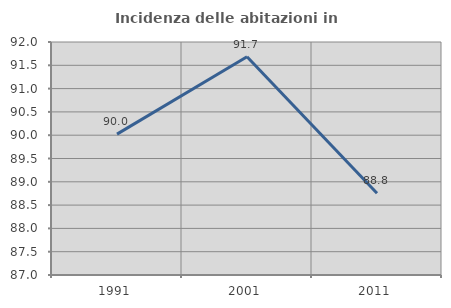
| Category | Incidenza delle abitazioni in proprietà  |
|---|---|
| 1991.0 | 90.023 |
| 2001.0 | 91.684 |
| 2011.0 | 88.753 |